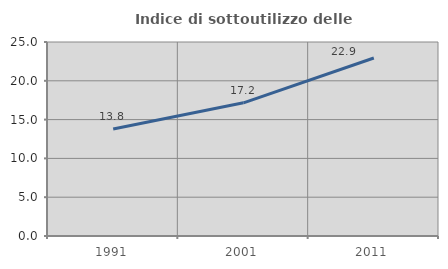
| Category | Indice di sottoutilizzo delle abitazioni  |
|---|---|
| 1991.0 | 13.786 |
| 2001.0 | 17.16 |
| 2011.0 | 22.936 |